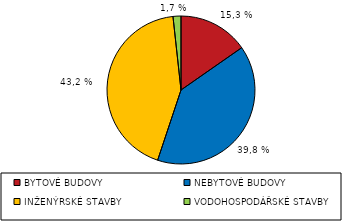
| Category | Series 0 |
|---|---|
| BYTOVÉ BUDOVY | 46344 |
| NEBYTOVÉ BUDOVY | 120426 |
| INŽENÝRSKÉ STAVBY | 130563 |
| VODOHOSPODÁŘSKÉ STAVBY | 5242 |